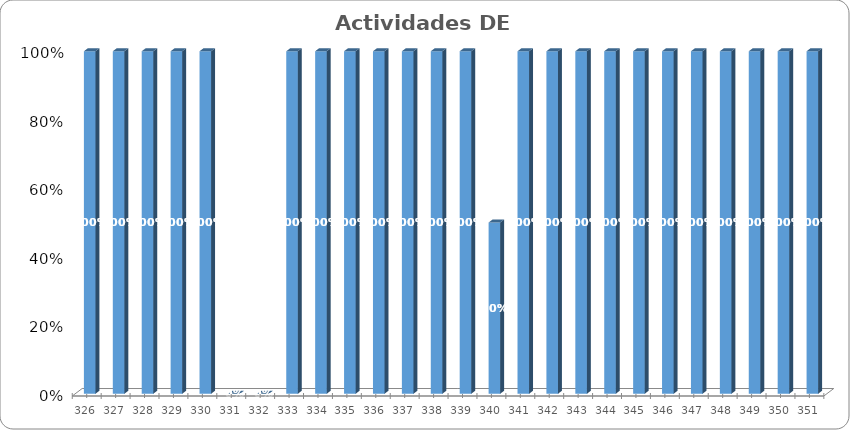
| Category | Series 0 |
|---|---|
| 326.0 | 1 |
| 327.0 | 1 |
| 328.0 | 1 |
| 329.0 | 1 |
| 330.0 | 1 |
| 331.0 | 0 |
| 332.0 | 0 |
| 333.0 | 1 |
| 334.0 | 1 |
| 335.0 | 1 |
| 336.0 | 1 |
| 337.0 | 1 |
| 338.0 | 1 |
| 339.0 | 1 |
| 340.0 | 0.5 |
| 341.0 | 1 |
| 342.0 | 1 |
| 343.0 | 1 |
| 344.0 | 1 |
| 345.0 | 1 |
| 346.0 | 1 |
| 347.0 | 1 |
| 348.0 | 1 |
| 349.0 | 1 |
| 350.0 | 1 |
| 351.0 | 1 |